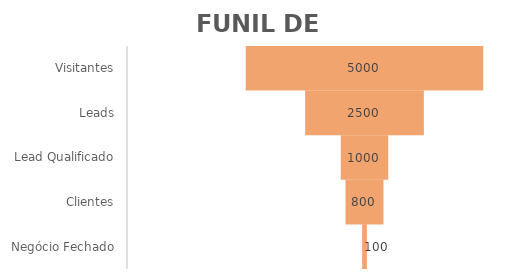
| Category | Series 0 | Series 1 |
|---|---|---|
| Visitantes | 2500 | 5000 |
| Leads | 3750 | 2500 |
| Lead Qualificado | 4500 | 1000 |
| Clientes | 4600 | 800 |
| Negócio Fechado | 4950 | 100 |